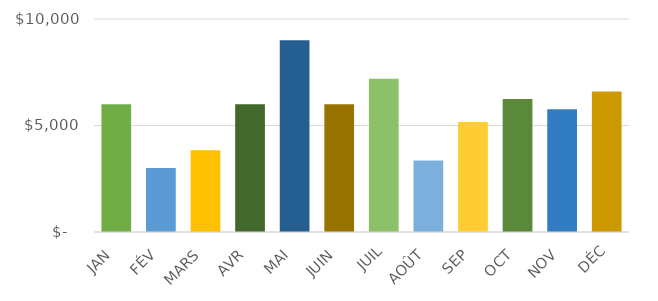
| Category | Series 0 |
|---|---|
| JAN | 6000 |
| FÉV | 3000 |
| MARS | 3840 |
| AVR | 6000 |
| MAI | 9000 |
| JUIN | 6000 |
| JUIL | 7200 |
| AOÛT | 3360 |
| SEP | 5160 |
| OCT | 6240 |
| NOV | 5760 |
| DÉC | 6600 |